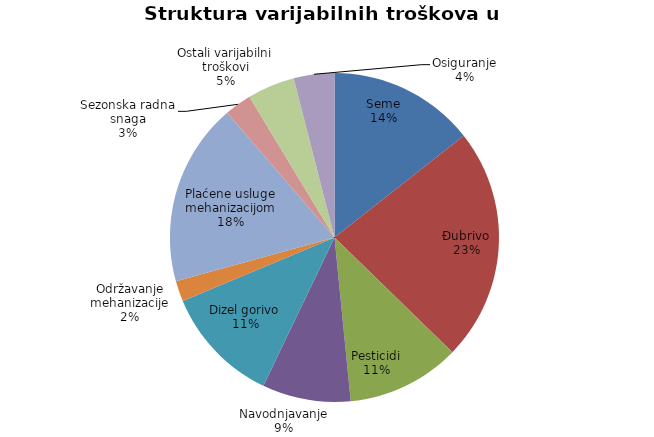
| Category | Series 0 |
|---|---|
| Seme | 10800 |
| Đubrivo | 17200 |
| Pesticidi | 8375 |
| Navodnjavanje | 6525 |
| Dizel gorivo | 8700 |
| Održavanje mehanizacije | 1514.423 |
| Plaćene usluge mehanizacijom | 13500 |
| Sezonska radna snaga | 2000 |
| Ostali varijabilni troškovi | 3500 |
| Osiguranje | 3000 |